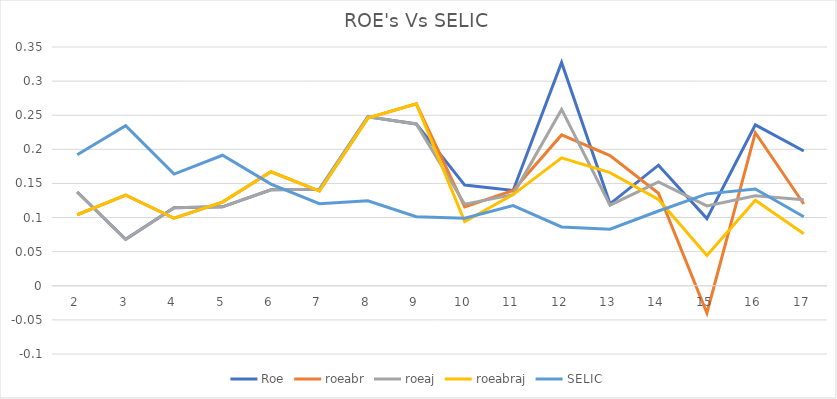
| Category | Roe | roeabr | roeaj | roeabraj | SELIC |
|---|---|---|---|---|---|
| 2.0 | 0.137 | 0.104 | 0.137 | 0.104 | 0.192 |
| 3.0 | 0.068 | 0.133 | 0.068 | 0.133 | 0.235 |
| 4.0 | 0.115 | 0.099 | 0.115 | 0.099 | 0.164 |
| 5.0 | 0.116 | 0.123 | 0.116 | 0.123 | 0.191 |
| 6.0 | 0.141 | 0.167 | 0.141 | 0.167 | 0.149 |
| 7.0 | 0.142 | 0.139 | 0.142 | 0.139 | 0.12 |
| 8.0 | 0.248 | 0.246 | 0.248 | 0.246 | 0.124 |
| 9.0 | 0.237 | 0.267 | 0.237 | 0.267 | 0.101 |
| 10.0 | 0.148 | 0.116 | 0.12 | 0.094 | 0.099 |
| 11.0 | 0.14 | 0.14 | 0.134 | 0.134 | 0.118 |
| 12.0 | 0.327 | 0.221 | 0.259 | 0.188 | 0.086 |
| 13.0 | 0.12 | 0.191 | 0.118 | 0.166 | 0.083 |
| 14.0 | 0.177 | 0.136 | 0.152 | 0.127 | 0.11 |
| 15.0 | 0.098 | -0.04 | 0.117 | 0.044 | 0.135 |
| 16.0 | 0.236 | 0.224 | 0.132 | 0.125 | 0.142 |
| 17.0 | 0.197 | 0.12 | 0.126 | 0.076 | 0.101 |